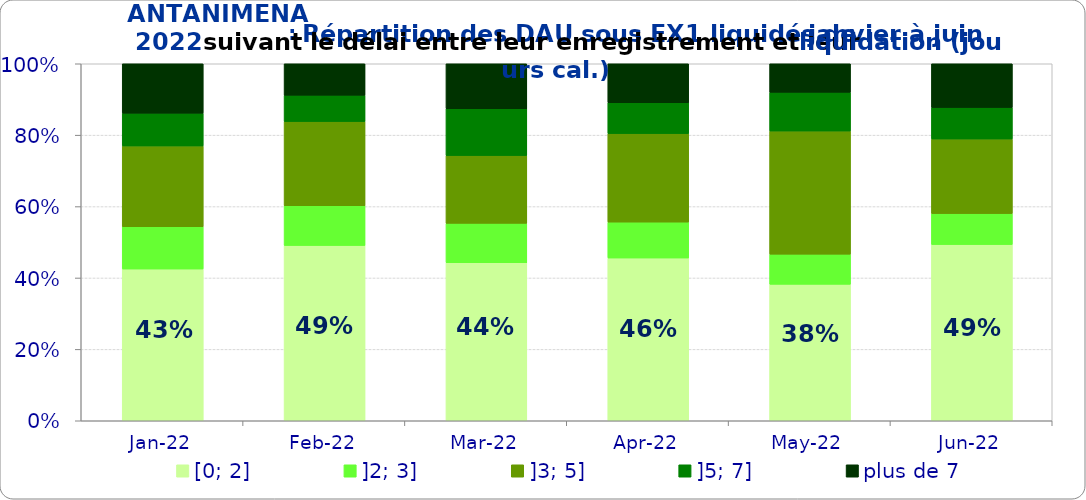
| Category | [0; 2] | ]2; 3] | ]3; 5] | ]5; 7] | plus de 7 |
|---|---|---|---|---|---|
| 2022-01-01 | 0.425 | 0.118 | 0.226 | 0.092 | 0.138 |
| 2022-02-01 | 0.491 | 0.111 | 0.236 | 0.074 | 0.088 |
| 2022-03-01 | 0.443 | 0.11 | 0.19 | 0.131 | 0.126 |
| 2022-04-01 | 0.456 | 0.101 | 0.248 | 0.087 | 0.109 |
| 2022-05-01 | 0.382 | 0.085 | 0.345 | 0.108 | 0.08 |
| 2022-06-01 | 0.494 | 0.087 | 0.209 | 0.088 | 0.123 |